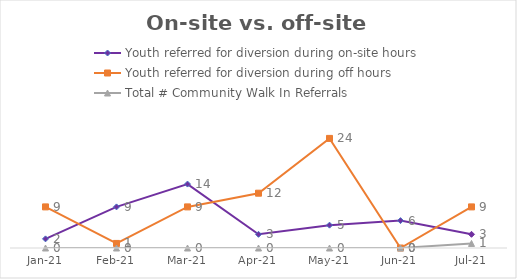
| Category | Youth referred for diversion during on-site hours | Youth referred for diversion during off hours | Total # Community Walk In Referrals |
|---|---|---|---|
| 2021-01-01 | 2 | 9 | 0 |
| 2021-02-01 | 9 | 1 | 0 |
| 2021-03-01 | 14 | 9 | 0 |
| 2021-04-01 | 3 | 12 | 0 |
| 2021-05-01 | 5 | 24 | 0 |
| 2021-06-01 | 6 | 0 | 0 |
| 2021-07-01 | 3 | 9 | 1 |